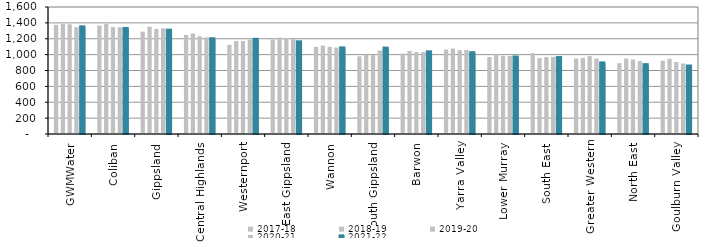
| Category | 2017-18 | 2018-19 | 2019-20 | 2020-21 | 2021-22 |
|---|---|---|---|---|---|
| GWMWater | 1374 | 1389.623 | 1381.085 | 1345.694 | 1343.967 |
| Coliban | 1366 | 1388.193 | 1347.154 | 1344.005 | 1323.738 |
| Gippsland | 1290 | 1351.933 | 1322.685 | 1331.418 | 1301.419 |
| Central Highlands | 1248 | 1265.837 | 1231.571 | 1217.305 | 1193.713 |
| Westernport | 1124 | 1170.176 | 1172.379 | 1189.284 | 1186.779 |
| East Gippsland | 1191 | 1214.102 | 1207.088 | 1194.252 | 1155.041 |
| Wannon | 1098 | 1113.35 | 1097.938 | 1089.064 | 1078.883 |
| South Gippsland | 978 | 998.825 | 992.918 | 1052.549 | 1076.092 |
| Barwon | 1013 | 1046.668 | 1031.825 | 1032.554 | 1028.843 |
| Yarra Valley | 1064 | 1076.551 | 1055.611 | 1058.256 | 1017.694 |
| Lower Murray | 970 | 1006.792 | 985.397 | 981.79 | 963.884 |
| South East | 1018 | 956.099 | 970.26 | 970.941 | 956.77 |
| Greater Western | 951.669 | 957.904 | 981.504 | 951.937 | 889.529 |
| North East | 892 | 950.859 | 938.421 | 918.106 | 867.813 |
| Goulburn Valley | 925 | 948.669 | 907.38 | 888.013 | 850.539 |